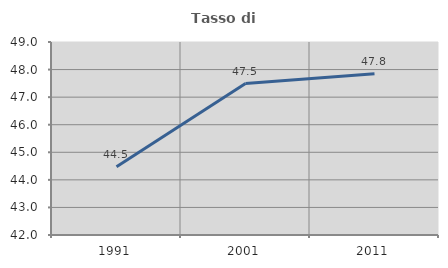
| Category | Tasso di occupazione   |
|---|---|
| 1991.0 | 44.475 |
| 2001.0 | 47.493 |
| 2011.0 | 47.849 |